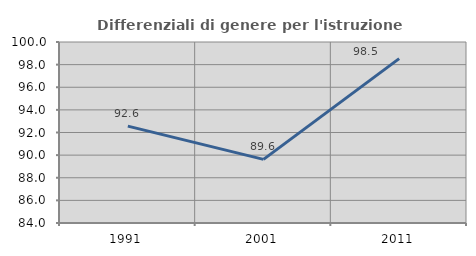
| Category | Differenziali di genere per l'istruzione superiore |
|---|---|
| 1991.0 | 92.566 |
| 2001.0 | 89.624 |
| 2011.0 | 98.533 |